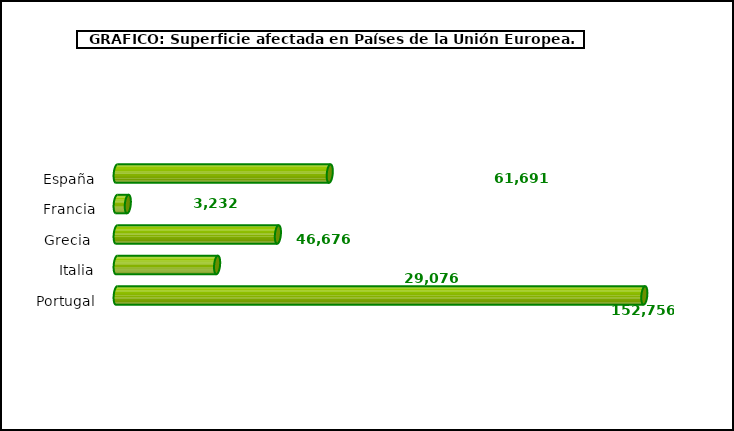
| Category | europa |
|---|---|
| España | 61690.61 |
| Francia | 3232 |
| Grecia  | 46676.46 |
| Italia | 29076 |
| Portugal | 152755.8 |